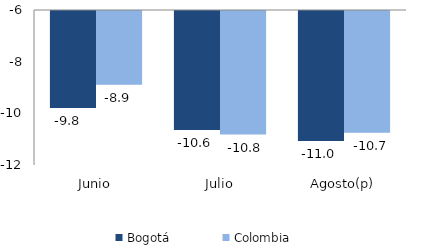
| Category | Bogotá | Colombia |
|---|---|---|
| Junio | -9.758 | -8.854 |
| Julio | -10.611 | -10.784 |
| Agosto(p) | -11.032 | -10.712 |